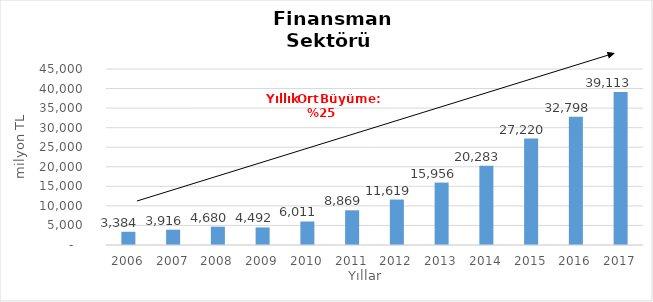
| Category | Finansman |
|---|---|
| 2006.0 | 3383.739 |
| 2007.0 | 3915.729 |
| 2008.0 | 4679.889 |
| 2009.0 | 4491.52 |
| 2010.0 | 6010.557 |
| 2011.0 | 8869.447 |
| 2012.0 | 11618.97 |
| 2013.0 | 15956.177 |
| 2014.0 | 20283 |
| 2015.0 | 27220 |
| 2016.0 | 32798 |
| 2017.0 | 39113 |